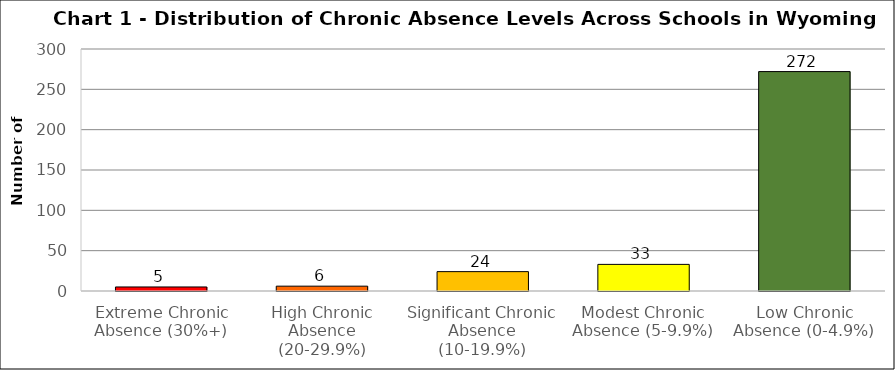
| Category | Series 0 |
|---|---|
| Extreme Chronic Absence (30%+) | 5 |
| High Chronic Absence (20-29.9%) | 6 |
| Significant Chronic Absence (10-19.9%) | 24 |
| Modest Chronic Absence (5-9.9%) | 33 |
| Low Chronic Absence (0-4.9%) | 272 |